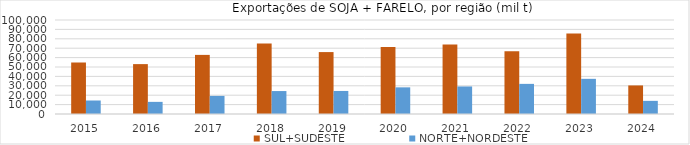
| Category | SUL+SUDESTE | NORTE+NORDESTE |
|---|---|---|
| 2015.0 | 54790.313 | 14360.514 |
| 2016.0 | 53073.46 | 12905.982 |
| 2017.0 | 62880.602 | 19267.201 |
| 2018.0 | 74935.61 | 24412.927 |
| 2019.0 | 65869.862 | 24521.801 |
| 2020.0 | 71161.424 | 28355.916 |
| 2021.0 | 73845.972 | 29295.579 |
| 2022.0 | 66760.174 | 32051.109 |
| 2023.0 | 85765.384 | 37406.056 |
| 2024.0 | 30387.623 | 13981.907 |